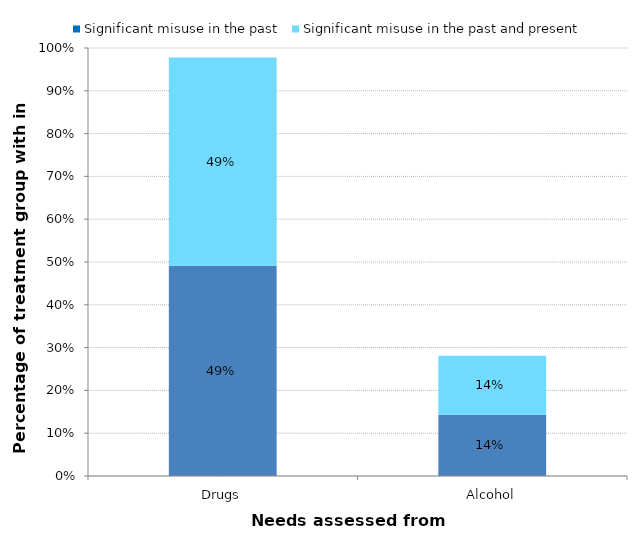
| Category | Significant misuse in the past | Significant misuse in the past and present |
|---|---|---|
| Drugs | 0.491 | 0.487 |
| Alcohol | 0.143 | 0.138 |